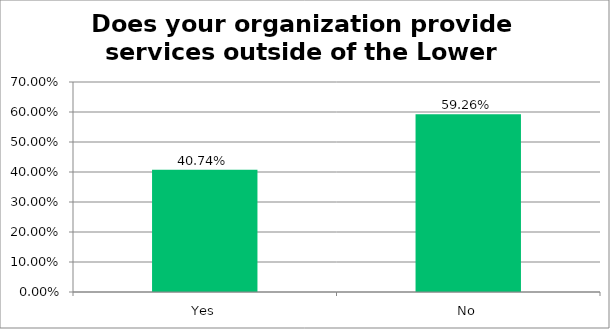
| Category | Responses |
|---|---|
| Yes | 0.407 |
| No | 0.593 |